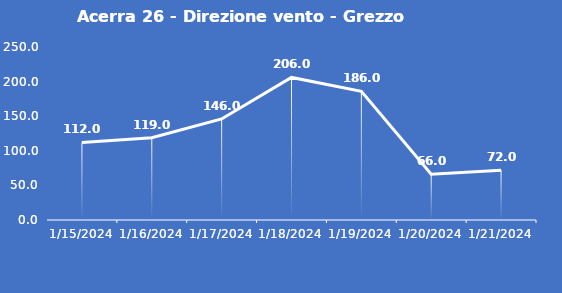
| Category | Acerra 26 - Direzione vento - Grezzo (°N) |
|---|---|
| 1/15/24 | 112 |
| 1/16/24 | 119 |
| 1/17/24 | 146 |
| 1/18/24 | 206 |
| 1/19/24 | 186 |
| 1/20/24 | 66 |
| 1/21/24 | 72 |